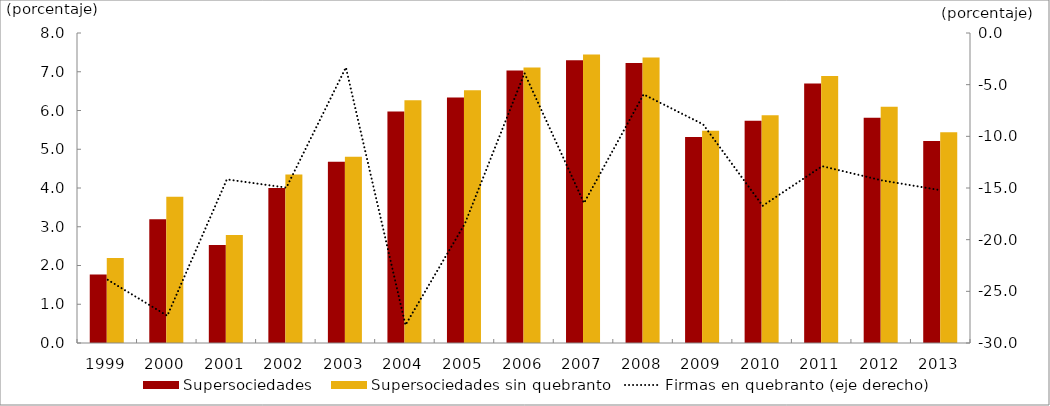
| Category | Supersociedades | Supersociedades sin quebranto |
|---|---|---|
| 1999.0 | 1.769 | 2.192 |
| 2000.0 | 3.191 | 3.775 |
| 2001.0 | 2.529 | 2.788 |
| 2002.0 | 3.999 | 4.347 |
| 2003.0 | 4.677 | 4.807 |
| 2004.0 | 5.977 | 6.262 |
| 2005.0 | 6.332 | 6.521 |
| 2006.0 | 7.031 | 7.111 |
| 2007.0 | 7.296 | 7.444 |
| 2008.0 | 7.223 | 7.366 |
| 2009.0 | 5.318 | 5.476 |
| 2010.0 | 5.733 | 5.879 |
| 2011.0 | 6.696 | 6.891 |
| 2012.0 | 5.812 | 6.099 |
| 2013.0 | 5.214 | 5.436 |